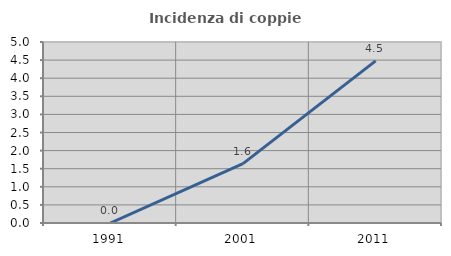
| Category | Incidenza di coppie miste |
|---|---|
| 1991.0 | 0 |
| 2001.0 | 1.639 |
| 2011.0 | 4.478 |